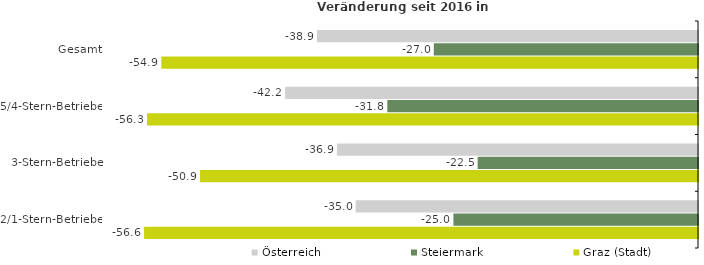
| Category | Österreich | Steiermark | Graz (Stadt) |
|---|---|---|---|
| Gesamt | -38.943 | -27.005 | -54.859 |
| 5/4-Stern-Betriebe | -42.206 | -31.755 | -56.317 |
| 3-Stern-Betriebe | -36.907 | -22.524 | -50.898 |
| 2/1-Stern-Betriebe | -34.996 | -25 | -56.621 |